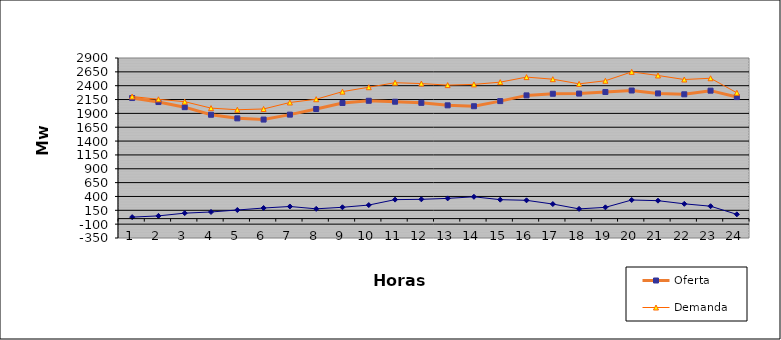
| Category | Oferta | Demanda | No Servida |
|---|---|---|---|
| 1.0 | 2177.19 | 2204.345 | 27.155 |
| 2.0 | 2104.73 | 2154.047 | 49.317 |
| 3.0 | 2012.39 | 2111.107 | 98.717 |
| 4.0 | 1875.26 | 1995.211 | 119.951 |
| 5.0 | 1810.18 | 1965.664 | 155.484 |
| 6.0 | 1788.37 | 1979.721 | 191.351 |
| 7.0 | 1877.43 | 2096.659 | 219.229 |
| 8.0 | 1979.22 | 2155.716 | 176.496 |
| 9.0 | 2087.5 | 2292.382 | 204.882 |
| 10.0 | 2127.69 | 2372.409 | 244.719 |
| 11.0 | 2110.82 | 2453.694 | 342.874 |
| 12.0 | 2089.94 | 2438.438 | 348.498 |
| 13.0 | 2045.32 | 2410.586 | 365.266 |
| 14.0 | 2029.14 | 2423.354 | 394.214 |
| 15.0 | 2121.73 | 2464.044 | 342.314 |
| 16.0 | 2224.94 | 2555.205 | 330.265 |
| 17.0 | 2254.45 | 2517.327 | 262.877 |
| 18.0 | 2257.69 | 2433.204 | 175.514 |
| 19.0 | 2285.84 | 2489.193 | 203.353 |
| 20.0 | 2313.12 | 2649.249 | 336.129 |
| 21.0 | 2260.54 | 2584.439 | 323.899 |
| 22.0 | 2244.49 | 2511.533 | 267.043 |
| 23.0 | 2310.2 | 2534.282 | 224.082 |
| 24.0 | 2194.65 | 2271.9 | 77.25 |